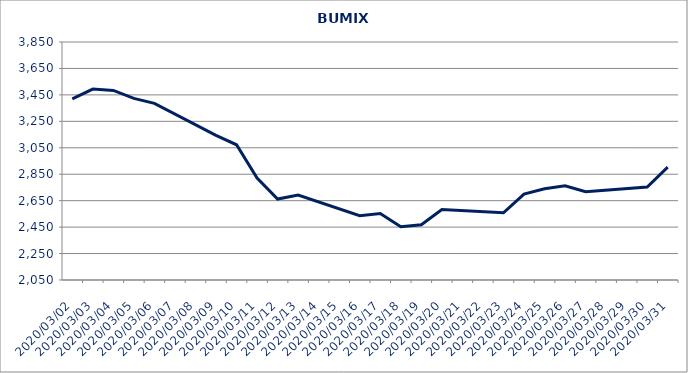
| Category | BUMIX |
|---|---|
| 2020-03-02 | 3420.246 |
| 2020-03-03 | 3494.226 |
| 2020-03-04 | 3483.577 |
| 2020-03-05 | 3423.588 |
| 2020-03-06 | 3385.851 |
| 2020-03-09 | 3144.177 |
| 2020-03-10 | 3072.652 |
| 2020-03-11 | 2820.535 |
| 2020-03-12 | 2662.105 |
| 2020-03-13 | 2692.893 |
| 2020-03-16 | 2536.434 |
| 2020-03-17 | 2553.266 |
| 2020-03-18 | 2452.38 |
| 2020-03-19 | 2467.745 |
| 2020-03-20 | 2582.933 |
| 2020-03-23 | 2557.974 |
| 2020-03-24 | 2699.957 |
| 2020-03-25 | 2740.292 |
| 2020-03-26 | 2762.106 |
| 2020-03-27 | 2717.193 |
| 2020-03-30 | 2753.32 |
| 2020-03-31 | 2903.405 |